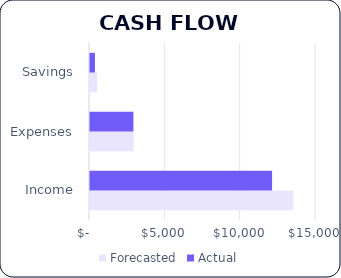
| Category | Forecasted | Actual |
|---|---|---|
| Income | 13500 | 12085 |
| Expenses | 2890 | 2880 |
| Savings | 470 | 330 |